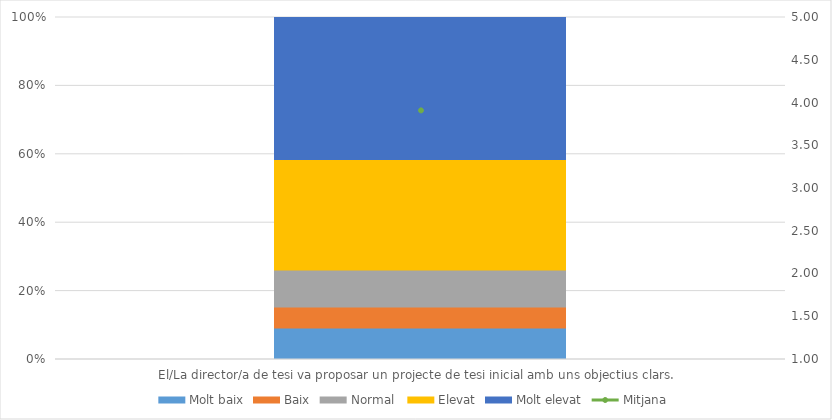
| Category | Molt baix | Baix | Normal  | Elevat | Molt elevat |
|---|---|---|---|---|---|
| El/La director/a de tesi va proposar un projecte de tesi inicial amb uns objectius clars.  | 6 | 4 | 7 | 21 | 27 |